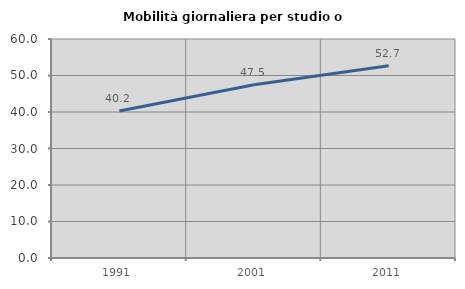
| Category | Mobilità giornaliera per studio o lavoro |
|---|---|
| 1991.0 | 40.248 |
| 2001.0 | 47.484 |
| 2011.0 | 52.67 |